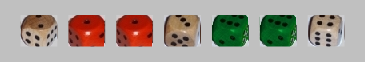
| Category | 1 | 2 | 3 | 4 | 5 | 6 |
|---|---|---|---|---|---|---|
| 2.0 | -1 | 1 | 0 | 0 | 0 | 0 |
| 1.0 | 1 | 0 | 0 | 0 | 0 | 0 |
| 1.0 | 1 | 0 | 0 | 0 | 0 | 0 |
| 3.0 | -1 | 0 | 1 | 0 | 0 | 0 |
| 6.0 | -1 | 0 | 0 | 0 | 0 | 1 |
| 6.0 | -1 | 0 | 0 | 0 | 0 | 1 |
| 4.0 | -1 | 0 | 0 | 1 | 0 | 0 |